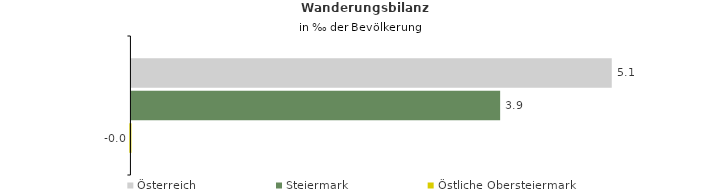
| Category | Österreich | Steiermark | Östliche Obersteiermark |
|---|---|---|---|
| Wanderungsrate in ‰ der Bevölkerung, Periode 2016-2020 | 5.087 | 3.905 | -0.011 |